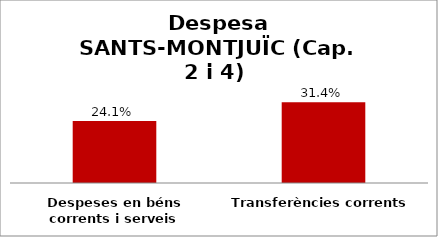
| Category | Series 0 |
|---|---|
| Despeses en béns corrents i serveis | 0.241 |
| Transferències corrents | 0.314 |